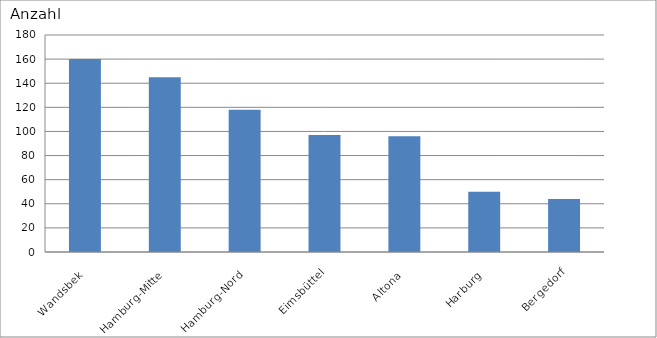
| Category | Wandsbek Hamburg-Mitte Hamburg-Nord Eimsbüttel Altona Harburg Bergedorf |
|---|---|
| Wandsbek | 160 |
| Hamburg-Mitte | 145 |
| Hamburg-Nord | 118 |
| Eimsbüttel | 97 |
| Altona | 96 |
| Harburg | 50 |
| Bergedorf | 44 |